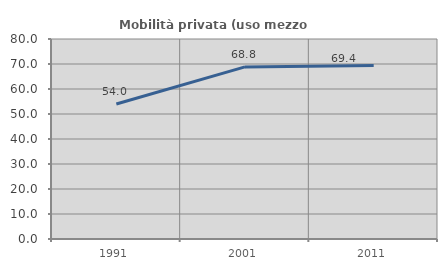
| Category | Mobilità privata (uso mezzo privato) |
|---|---|
| 1991.0 | 54.016 |
| 2001.0 | 68.847 |
| 2011.0 | 69.444 |